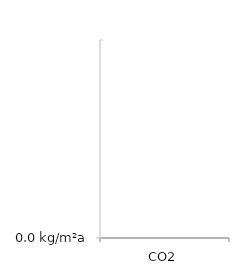
| Category | Series 0 | Series 1 |
|---|---|---|
| CO2 | 0 | 0 |